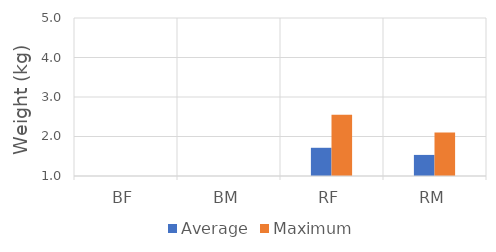
| Category | Average | Maximum |
|---|---|---|
| BF | 0 | 0 |
| BM | 0 | 0 |
| RF | 1.714 | 2.55 |
| RM | 1.534 | 2.1 |